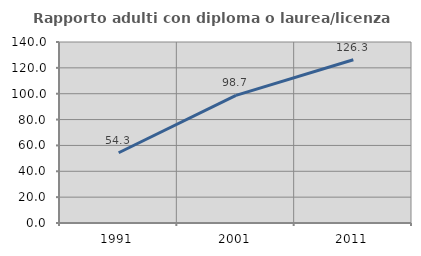
| Category | Rapporto adulti con diploma o laurea/licenza media  |
|---|---|
| 1991.0 | 54.34 |
| 2001.0 | 98.745 |
| 2011.0 | 126.262 |